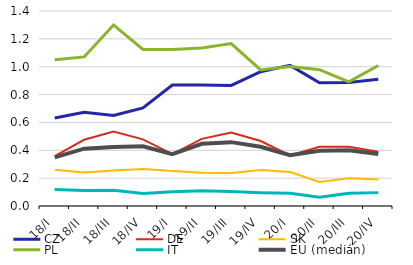
| Category | CZ | DE | SK | PL | IT | EU (medián) |
|---|---|---|---|---|---|---|
| 18/I | 0.632 | 0.358 | 0.259 | 1.05 | 0.119 | 0.349 |
| 18/II | 0.674 | 0.475 | 0.24 | 1.071 | 0.111 | 0.412 |
| 18/III | 0.65 | 0.535 | 0.254 | 1.3 | 0.113 | 0.424 |
| 18/IV | 0.704 | 0.478 | 0.265 | 1.124 | 0.089 | 0.429 |
| 19/I | 0.868 | 0.372 | 0.25 | 1.124 | 0.103 | 0.372 |
| 19/II | 0.869 | 0.482 | 0.239 | 1.135 | 0.11 | 0.446 |
| 19/III | 0.866 | 0.527 | 0.238 | 1.166 | 0.103 | 0.458 |
| 19/IV | 0.964 | 0.467 | 0.258 | 0.977 | 0.096 | 0.426 |
| 20/I | 1.01 | 0.363 | 0.244 | 1.002 | 0.091 | 0.364 |
| 20/II | 0.884 | 0.425 | 0.173 | 0.979 | 0.063 | 0.397 |
| 20/III | 0.886 | 0.425 | 0.199 | 0.891 | 0.091 | 0.401 |
| 20/IV | 0.91 | 0.39 | 0.191 | 1.009 | 0.096 | 0.373 |